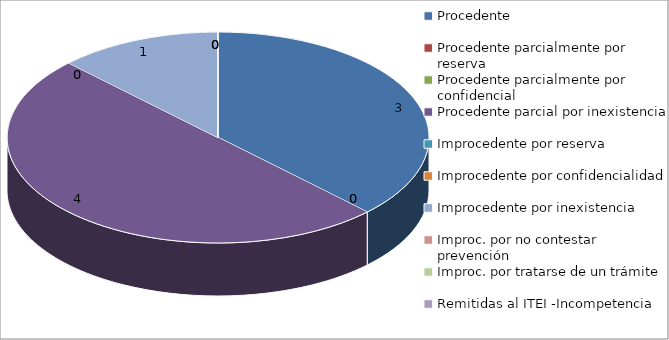
| Category | Series 0 |
|---|---|
| Procedente | 3 |
| Procedente parcialmente por reserva  | 0 |
| Procedente parcialmente por confidencial | 0 |
| Procedente parcial por inexistencia | 4 |
| Improcedente por reserva  | 0 |
| Improcedente por confidencialidad | 0 |
| Improcedente por inexistencia  | 1 |
| Improc. por no contestar prevención | 0 |
| Improc. por tratarse de un trámite  | 0 |
| Remitidas al ITEI -Incompetencia  | 0 |